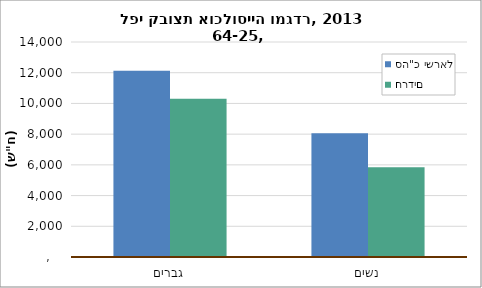
| Category | סה"כ ישראל | חרדים |
|---|---|---|
| גברים | 12130.49 | 10309.56 |
| נשים | 8065.64 | 5837.59 |